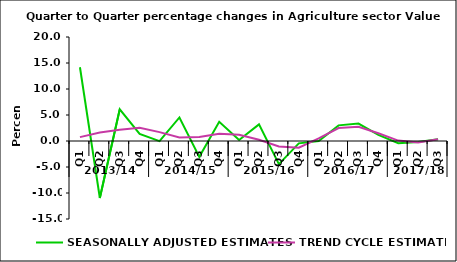
| Category | SEASONALLY ADJUSTED ESTIMATES | TREND CYCLE ESTIMATES |
|---|---|---|
| 0 | 14.187 | 0.742 |
| 1 | -10.966 | 1.65 |
| 2 | 6.085 | 2.148 |
| 3 | 1.352 | 2.524 |
| 4 | -0.035 | 1.705 |
| 5 | 4.53 | 0.688 |
| 6 | -3.044 | 0.779 |
| 7 | 3.702 | 1.395 |
| 8 | 0.205 | 1.204 |
| 9 | 3.203 | 0.23 |
| 10 | -4.445 | -1.066 |
| 11 | -0.456 | -1.275 |
| 12 | 0.011 | 0.503 |
| 13 | 3.009 | 2.481 |
| 14 | 3.347 | 2.723 |
| 15 | 1.189 | 1.482 |
| 16 | -0.411 | 0.082 |
| 17 | -0.206 | -0.296 |
| 18 | 0.356 | 0.352 |